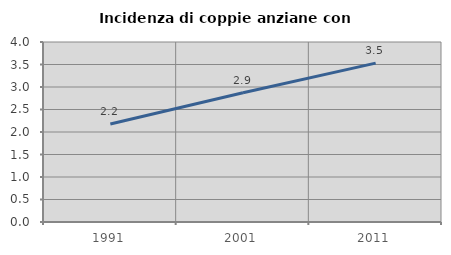
| Category | Incidenza di coppie anziane con figli |
|---|---|
| 1991.0 | 2.177 |
| 2001.0 | 2.874 |
| 2011.0 | 3.531 |